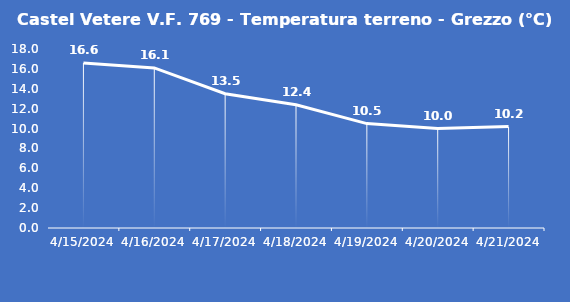
| Category | Castel Vetere V.F. 769 - Temperatura terreno - Grezzo (°C) |
|---|---|
| 4/15/24 | 16.6 |
| 4/16/24 | 16.1 |
| 4/17/24 | 13.5 |
| 4/18/24 | 12.4 |
| 4/19/24 | 10.5 |
| 4/20/24 | 10 |
| 4/21/24 | 10.2 |